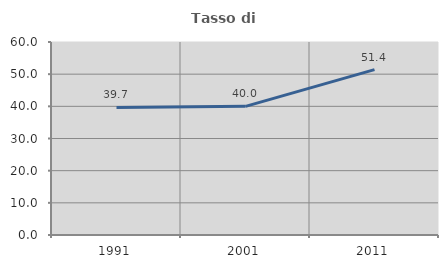
| Category | Tasso di occupazione   |
|---|---|
| 1991.0 | 39.669 |
| 2001.0 | 40 |
| 2011.0 | 51.412 |